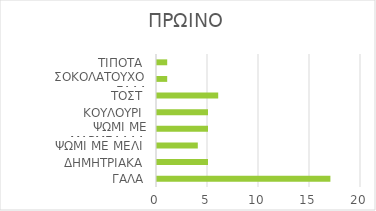
| Category | Series 0 |
|---|---|
| ΓΑΛΑ | 17 |
| ΔΗΜΗΤΡΙΑΚΑ | 5 |
| ΨΩΜΙ ΜΕ ΜΕΛΙ | 4 |
| ΨΩΜΙ ΜΕ ΜΑΡΜΕΛΑΔΑ | 5 |
| ΚΟΥΛΟΥΡΙ | 5 |
| ΤΟΣΤ | 6 |
| ΣΟΚΟΛΑΤΟΥΧΟ ΓΑΛΑ | 1 |
| ΤΙΠΟΤΑ | 1 |